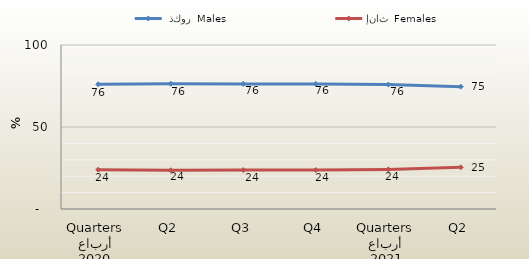
| Category |  ذكور  Males | إناث  Females |
|---|---|---|
| 0 | 76.046 | 23.954 |
| 1 | 76.38 | 23.62 |
| 2 | 76.286 | 23.714 |
| 3 | 76.241 | 23.759 |
| 4 | 75.852 | 24.148 |
| 5 | 74.599 | 25.401 |